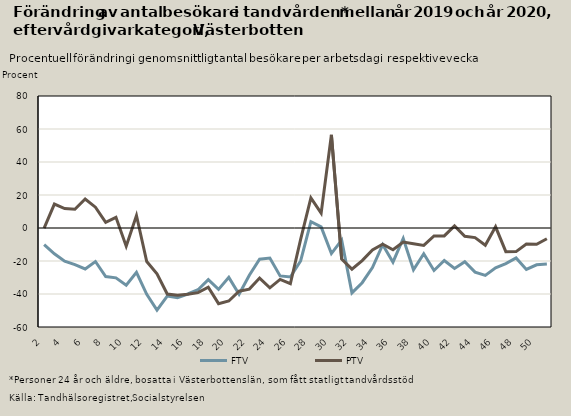
| Category | FTV | PTV |
|---|---|---|
| 2.0 | -10.095 | -0.079 |
| 3.0 | -15.654 | 14.514 |
| 4.0 | -20.148 | 11.784 |
| 5.0 | -22.21 | 11.37 |
| 6.0 | -24.818 | 17.575 |
| 7.0 | -20.321 | 12.612 |
| 8.0 | -29.457 | 3.403 |
| 9.0 | -30.217 | 6.474 |
| 10.0 | -34.725 | -10.997 |
| 11.0 | -26.923 | 7.591 |
| 12.0 | -40.166 | -20.326 |
| 13.0 | -49.72 | -27.798 |
| 14.0 | -41.238 | -40.025 |
| 15.0 | -42.214 | -40.823 |
| 16.0 | -40 | -40.153 |
| 17.0 | -37.425 | -39.172 |
| 18.0 | -31.274 | -35.875 |
| 19.0 | -37.192 | -45.854 |
| 20.0 | -29.933 | -44.223 |
| 21.0 | -40.151 | -38.276 |
| 22.0 | -28.646 | -37.035 |
| 23.0 | -18.95 | -30.334 |
| 24.0 | -18.255 | -36.235 |
| 25.0 | -29.042 | -31.148 |
| 26.0 | -29.697 | -33.791 |
| 27.0 | -19.968 | -6.849 |
| 28.0 | 3.833 | 18.265 |
| 29.0 | 0.702 | 9.04 |
| 30.0 | -15.49 | 56.489 |
| 31.0 | -7.341 | -18.884 |
| 32.0 | -39.318 | -24.955 |
| 33.0 | -33.16 | -19.769 |
| 34.0 | -24.01 | -13.351 |
| 35.0 | -10.146 | -9.877 |
| 36.0 | -20.706 | -13.174 |
| 37.0 | -6.361 | -8.483 |
| 38.0 | -25.379 | -9.484 |
| 39.0 | -15.631 | -10.542 |
| 40.0 | -25.752 | -4.83 |
| 41.0 | -19.707 | -4.81 |
| 42.0 | -24.538 | 1.229 |
| 43.0 | -20.442 | -4.983 |
| 44.0 | -26.735 | -5.826 |
| 45.0 | -28.703 | -10.448 |
| 46.0 | -24.107 | 0.725 |
| 47.0 | -21.594 | -14.331 |
| 48.0 | -18.161 | -14.315 |
| 49.0 | -25.128 | -9.707 |
| 50.0 | -22.308 | -9.899 |
| 51.0 | -21.774 | -6.492 |